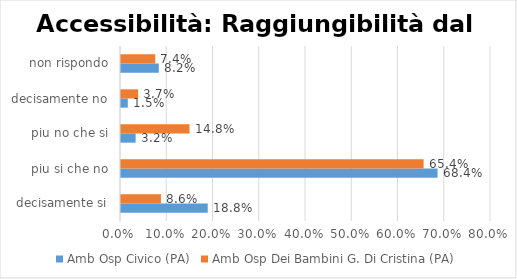
| Category | Amb Osp Civico (PA) | Amb Osp Dei Bambini G. Di Cristina (PA) |
|---|---|---|
| decisamente si | 0.188 | 0.086 |
| piu si che no | 0.684 | 0.654 |
| piu no che si | 0.032 | 0.148 |
| decisamente no | 0.015 | 0.037 |
| non rispondo | 0.082 | 0.074 |